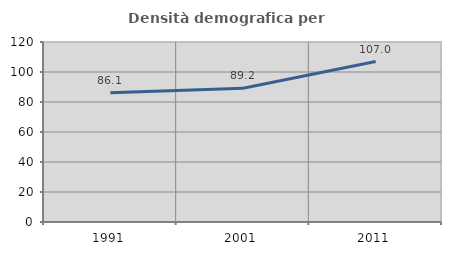
| Category | Densità demografica |
|---|---|
| 1991.0 | 86.122 |
| 2001.0 | 89.168 |
| 2011.0 | 106.983 |